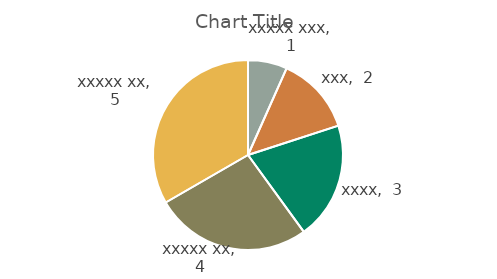
| Category | Series 0 |
|---|---|
| xxxxx xxx | 1 |
| xxx | 2 |
| xxxx | 3 |
| xxxxx xx | 4 |
| xxxxx xx | 5 |